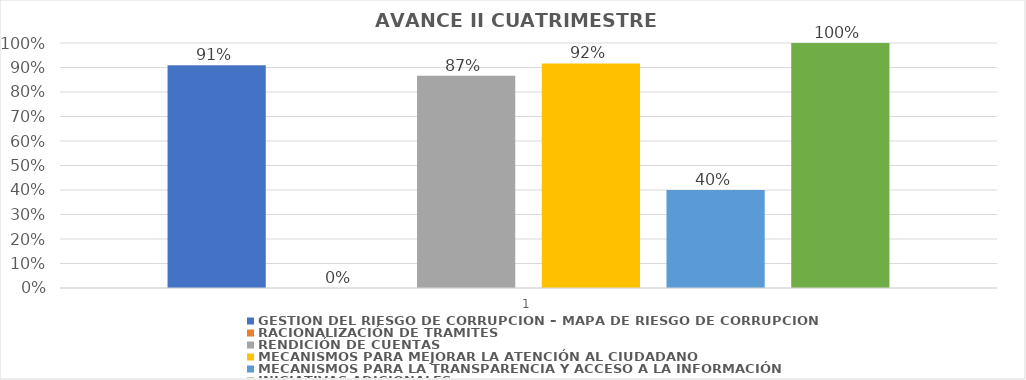
| Category | GESTIÓN DEL RIESGO DE CORRUPCIÓN – MAPA DE RIESGO DE CORRUPCIÓN  | RACIONALIZACIÓN DE TRAMITES | RENDICIÓN DE CUENTAS | MECANISMOS PARA MEJORAR LA ATENCIÓN AL CIUDADANO | MECANISMOS PARA LA TRANSPARENCIA Y ACCESO A LA INFORMACIÓN | INICIATIVAS ADICIONALES |
|---|---|---|---|---|---|---|
| 0 | 0.909 | 0 | 0.867 | 0.917 | 0.4 | 1 |